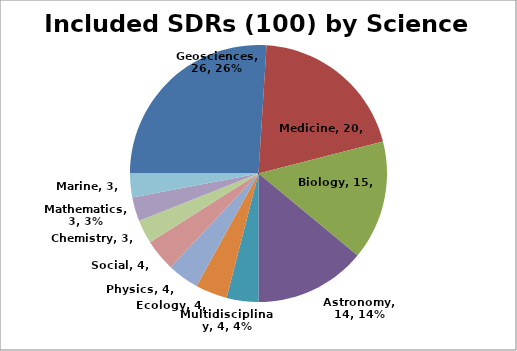
| Category | Total |
|---|---|
| Geosciences | 26 |
| Medicine | 20 |
| Biology | 15 |
| Astronomy | 14 |
| Multidisciplinary | 4 |
| Ecology | 4 |
| Physics | 4 |
| Social | 4 |
| Chemistry | 3 |
| Mathematics | 3 |
| Marine | 3 |